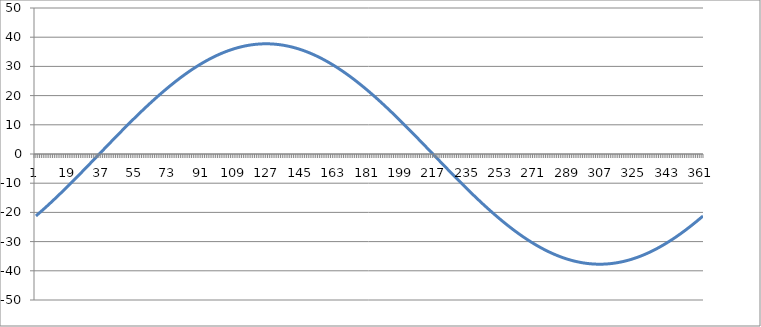
| Category | Series 0 |
|---|---|
| 0 | -21.213 |
| 1 | -20.665 |
| 2 | -20.111 |
| 3 | -19.551 |
| 4 | -18.984 |
| 5 | -18.412 |
| 6 | -17.834 |
| 7 | -17.251 |
| 8 | -16.663 |
| 9 | -16.069 |
| 10 | -15.471 |
| 11 | -14.868 |
| 12 | -14.26 |
| 13 | -13.648 |
| 14 | -13.032 |
| 15 | -12.412 |
| 16 | -11.788 |
| 17 | -11.16 |
| 18 | -10.53 |
| 19 | -9.895 |
| 20 | -9.258 |
| 21 | -8.618 |
| 22 | -7.976 |
| 23 | -7.331 |
| 24 | -6.684 |
| 25 | -6.034 |
| 26 | -5.383 |
| 27 | -4.731 |
| 28 | -4.076 |
| 29 | -3.421 |
| 30 | -2.765 |
| 31 | -2.107 |
| 32 | -1.449 |
| 33 | -0.791 |
| 34 | -0.132 |
| 35 | 0.526 |
| 36 | 1.185 |
| 37 | 1.843 |
| 38 | 2.501 |
| 39 | 3.157 |
| 40 | 3.813 |
| 41 | 4.468 |
| 42 | 5.121 |
| 43 | 5.773 |
| 44 | 6.423 |
| 45 | 7.071 |
| 46 | 7.717 |
| 47 | 8.361 |
| 48 | 9.002 |
| 49 | 9.64 |
| 50 | 10.275 |
| 51 | 10.907 |
| 52 | 11.536 |
| 53 | 12.162 |
| 54 | 12.783 |
| 55 | 13.401 |
| 56 | 14.015 |
| 57 | 14.624 |
| 58 | 15.229 |
| 59 | 15.829 |
| 60 | 16.425 |
| 61 | 17.015 |
| 62 | 17.601 |
| 63 | 18.181 |
| 64 | 18.755 |
| 65 | 19.324 |
| 66 | 19.886 |
| 67 | 20.443 |
| 68 | 20.994 |
| 69 | 21.538 |
| 70 | 22.075 |
| 71 | 22.606 |
| 72 | 23.13 |
| 73 | 23.647 |
| 74 | 24.157 |
| 75 | 24.659 |
| 76 | 25.154 |
| 77 | 25.641 |
| 78 | 26.121 |
| 79 | 26.592 |
| 80 | 27.055 |
| 81 | 27.51 |
| 82 | 27.957 |
| 83 | 28.395 |
| 84 | 28.825 |
| 85 | 29.246 |
| 86 | 29.657 |
| 87 | 30.06 |
| 88 | 30.454 |
| 89 | 30.838 |
| 90 | 31.213 |
| 91 | 31.579 |
| 92 | 31.935 |
| 93 | 32.281 |
| 94 | 32.617 |
| 95 | 32.943 |
| 96 | 33.26 |
| 97 | 33.566 |
| 98 | 33.862 |
| 99 | 34.147 |
| 100 | 34.423 |
| 101 | 34.687 |
| 102 | 34.942 |
| 103 | 35.185 |
| 104 | 35.418 |
| 105 | 35.64 |
| 106 | 35.851 |
| 107 | 36.051 |
| 108 | 36.241 |
| 109 | 36.419 |
| 110 | 36.586 |
| 111 | 36.742 |
| 112 | 36.887 |
| 113 | 37.021 |
| 114 | 37.143 |
| 115 | 37.254 |
| 116 | 37.353 |
| 117 | 37.442 |
| 118 | 37.519 |
| 119 | 37.584 |
| 120 | 37.638 |
| 121 | 37.681 |
| 122 | 37.712 |
| 123 | 37.731 |
| 124 | 37.739 |
| 125 | 37.736 |
| 126 | 37.721 |
| 127 | 37.694 |
| 128 | 37.656 |
| 129 | 37.607 |
| 130 | 37.546 |
| 131 | 37.474 |
| 132 | 37.39 |
| 133 | 37.295 |
| 134 | 37.189 |
| 135 | 37.071 |
| 136 | 36.942 |
| 137 | 36.802 |
| 138 | 36.65 |
| 139 | 36.488 |
| 140 | 36.314 |
| 141 | 36.129 |
| 142 | 35.933 |
| 143 | 35.726 |
| 144 | 35.509 |
| 145 | 35.28 |
| 146 | 35.041 |
| 147 | 34.791 |
| 148 | 34.53 |
| 149 | 34.259 |
| 150 | 33.978 |
| 151 | 33.686 |
| 152 | 33.384 |
| 153 | 33.072 |
| 154 | 32.749 |
| 155 | 32.417 |
| 156 | 32.075 |
| 157 | 31.723 |
| 158 | 31.361 |
| 159 | 30.99 |
| 160 | 30.609 |
| 161 | 30.22 |
| 162 | 29.82 |
| 163 | 29.412 |
| 164 | 28.995 |
| 165 | 28.569 |
| 166 | 28.134 |
| 167 | 27.691 |
| 168 | 27.239 |
| 169 | 26.779 |
| 170 | 26.311 |
| 171 | 25.835 |
| 172 | 25.351 |
| 173 | 24.859 |
| 174 | 24.36 |
| 175 | 23.853 |
| 176 | 23.339 |
| 177 | 22.818 |
| 178 | 22.29 |
| 179 | 21.755 |
| 180 | 21.213 |
| 181 | 20.665 |
| 182 | 20.111 |
| 183 | 19.551 |
| 184 | 18.984 |
| 185 | 18.412 |
| 186 | 17.834 |
| 187 | 17.251 |
| 188 | 16.663 |
| 189 | 16.069 |
| 190 | 15.471 |
| 191 | 14.868 |
| 192 | 14.26 |
| 193 | 13.648 |
| 194 | 13.032 |
| 195 | 12.412 |
| 196 | 11.788 |
| 197 | 11.16 |
| 198 | 10.53 |
| 199 | 9.895 |
| 200 | 9.258 |
| 201 | 8.618 |
| 202 | 7.976 |
| 203 | 7.331 |
| 204 | 6.684 |
| 205 | 6.034 |
| 206 | 5.383 |
| 207 | 4.731 |
| 208 | 4.076 |
| 209 | 3.421 |
| 210 | 2.765 |
| 211 | 2.107 |
| 212 | 1.449 |
| 213 | 0.791 |
| 214 | 0.132 |
| 215 | -0.526 |
| 216 | -1.185 |
| 217 | -1.843 |
| 218 | -2.501 |
| 219 | -3.157 |
| 220 | -3.813 |
| 221 | -4.468 |
| 222 | -5.121 |
| 223 | -5.773 |
| 224 | -6.423 |
| 225 | -7.071 |
| 226 | -7.717 |
| 227 | -8.361 |
| 228 | -9.002 |
| 229 | -9.64 |
| 230 | -10.275 |
| 231 | -10.907 |
| 232 | -11.536 |
| 233 | -12.162 |
| 234 | -12.783 |
| 235 | -13.401 |
| 236 | -14.015 |
| 237 | -14.624 |
| 238 | -15.229 |
| 239 | -15.829 |
| 240 | -16.425 |
| 241 | -17.015 |
| 242 | -17.601 |
| 243 | -18.181 |
| 244 | -18.755 |
| 245 | -19.324 |
| 246 | -19.886 |
| 247 | -20.443 |
| 248 | -20.994 |
| 249 | -21.538 |
| 250 | -22.075 |
| 251 | -22.606 |
| 252 | -23.13 |
| 253 | -23.647 |
| 254 | -24.157 |
| 255 | -24.659 |
| 256 | -25.154 |
| 257 | -25.641 |
| 258 | -26.121 |
| 259 | -26.592 |
| 260 | -27.055 |
| 261 | -27.51 |
| 262 | -27.957 |
| 263 | -28.395 |
| 264 | -28.825 |
| 265 | -29.246 |
| 266 | -29.657 |
| 267 | -30.06 |
| 268 | -30.454 |
| 269 | -30.838 |
| 270 | -31.213 |
| 271 | -31.579 |
| 272 | -31.935 |
| 273 | -32.281 |
| 274 | -32.617 |
| 275 | -32.943 |
| 276 | -33.26 |
| 277 | -33.566 |
| 278 | -33.862 |
| 279 | -34.147 |
| 280 | -34.423 |
| 281 | -34.687 |
| 282 | -34.942 |
| 283 | -35.185 |
| 284 | -35.418 |
| 285 | -35.64 |
| 286 | -35.851 |
| 287 | -36.051 |
| 288 | -36.241 |
| 289 | -36.419 |
| 290 | -36.586 |
| 291 | -36.742 |
| 292 | -36.887 |
| 293 | -37.021 |
| 294 | -37.143 |
| 295 | -37.254 |
| 296 | -37.353 |
| 297 | -37.442 |
| 298 | -37.519 |
| 299 | -37.584 |
| 300 | -37.638 |
| 301 | -37.681 |
| 302 | -37.712 |
| 303 | -37.731 |
| 304 | -37.739 |
| 305 | -37.736 |
| 306 | -37.721 |
| 307 | -37.694 |
| 308 | -37.656 |
| 309 | -37.607 |
| 310 | -37.546 |
| 311 | -37.474 |
| 312 | -37.39 |
| 313 | -37.295 |
| 314 | -37.189 |
| 315 | -37.071 |
| 316 | -36.942 |
| 317 | -36.802 |
| 318 | -36.65 |
| 319 | -36.488 |
| 320 | -36.314 |
| 321 | -36.129 |
| 322 | -35.933 |
| 323 | -35.726 |
| 324 | -35.509 |
| 325 | -35.28 |
| 326 | -35.041 |
| 327 | -34.791 |
| 328 | -34.53 |
| 329 | -34.259 |
| 330 | -33.978 |
| 331 | -33.686 |
| 332 | -33.384 |
| 333 | -33.072 |
| 334 | -32.749 |
| 335 | -32.417 |
| 336 | -32.075 |
| 337 | -31.723 |
| 338 | -31.361 |
| 339 | -30.99 |
| 340 | -30.609 |
| 341 | -30.22 |
| 342 | -29.82 |
| 343 | -29.412 |
| 344 | -28.995 |
| 345 | -28.569 |
| 346 | -28.134 |
| 347 | -27.691 |
| 348 | -27.239 |
| 349 | -26.779 |
| 350 | -26.311 |
| 351 | -25.835 |
| 352 | -25.351 |
| 353 | -24.859 |
| 354 | -24.36 |
| 355 | -23.853 |
| 356 | -23.339 |
| 357 | -22.818 |
| 358 | -22.29 |
| 359 | -21.755 |
| 360 | -21.213 |